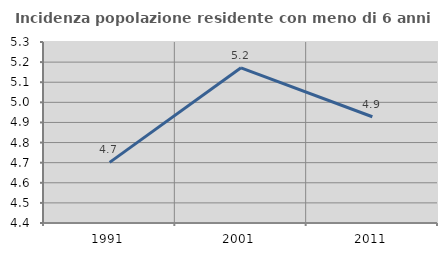
| Category | Incidenza popolazione residente con meno di 6 anni |
|---|---|
| 1991.0 | 4.701 |
| 2001.0 | 5.172 |
| 2011.0 | 4.928 |